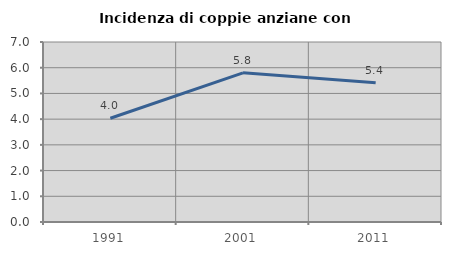
| Category | Incidenza di coppie anziane con figli |
|---|---|
| 1991.0 | 4.036 |
| 2001.0 | 5.802 |
| 2011.0 | 5.419 |